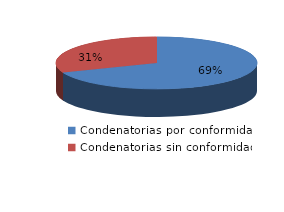
| Category | Series 0 |
|---|---|
| 0 | 3951 |
| 1 | 1774 |